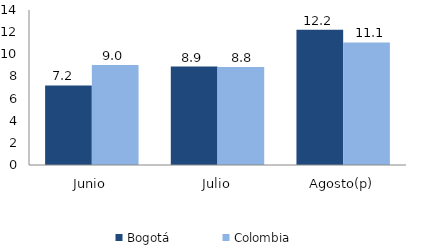
| Category | Bogotá | Colombia |
|---|---|---|
| Junio | 7.184 | 9.034 |
| Julio | 8.89 | 8.848 |
| Agosto(p) | 12.207 | 11.065 |